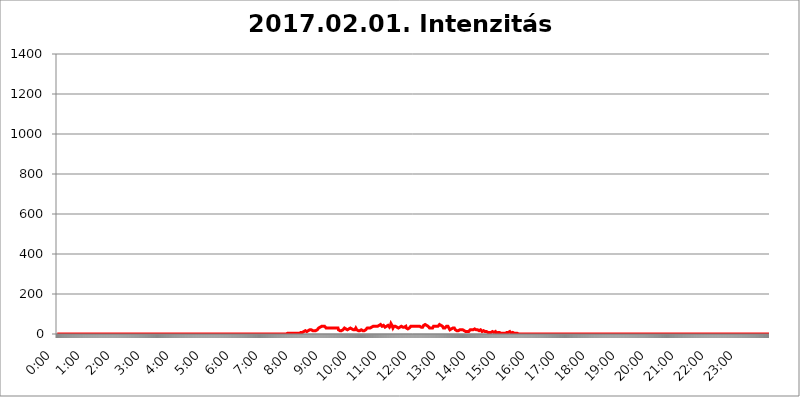
| Category | 2017.02.01. Intenzitás [W/m^2] |
|---|---|
| 0.0 | 0 |
| 0.0006944444444444445 | 0 |
| 0.001388888888888889 | 0 |
| 0.0020833333333333333 | 0 |
| 0.002777777777777778 | 0 |
| 0.003472222222222222 | 0 |
| 0.004166666666666667 | 0 |
| 0.004861111111111111 | 0 |
| 0.005555555555555556 | 0 |
| 0.0062499999999999995 | 0 |
| 0.006944444444444444 | 0 |
| 0.007638888888888889 | 0 |
| 0.008333333333333333 | 0 |
| 0.009027777777777779 | 0 |
| 0.009722222222222222 | 0 |
| 0.010416666666666666 | 0 |
| 0.011111111111111112 | 0 |
| 0.011805555555555555 | 0 |
| 0.012499999999999999 | 0 |
| 0.013194444444444444 | 0 |
| 0.013888888888888888 | 0 |
| 0.014583333333333332 | 0 |
| 0.015277777777777777 | 0 |
| 0.015972222222222224 | 0 |
| 0.016666666666666666 | 0 |
| 0.017361111111111112 | 0 |
| 0.018055555555555557 | 0 |
| 0.01875 | 0 |
| 0.019444444444444445 | 0 |
| 0.02013888888888889 | 0 |
| 0.020833333333333332 | 0 |
| 0.02152777777777778 | 0 |
| 0.022222222222222223 | 0 |
| 0.02291666666666667 | 0 |
| 0.02361111111111111 | 0 |
| 0.024305555555555556 | 0 |
| 0.024999999999999998 | 0 |
| 0.025694444444444447 | 0 |
| 0.02638888888888889 | 0 |
| 0.027083333333333334 | 0 |
| 0.027777777777777776 | 0 |
| 0.02847222222222222 | 0 |
| 0.029166666666666664 | 0 |
| 0.029861111111111113 | 0 |
| 0.030555555555555555 | 0 |
| 0.03125 | 0 |
| 0.03194444444444445 | 0 |
| 0.03263888888888889 | 0 |
| 0.03333333333333333 | 0 |
| 0.034027777777777775 | 0 |
| 0.034722222222222224 | 0 |
| 0.035416666666666666 | 0 |
| 0.036111111111111115 | 0 |
| 0.03680555555555556 | 0 |
| 0.0375 | 0 |
| 0.03819444444444444 | 0 |
| 0.03888888888888889 | 0 |
| 0.03958333333333333 | 0 |
| 0.04027777777777778 | 0 |
| 0.04097222222222222 | 0 |
| 0.041666666666666664 | 0 |
| 0.042361111111111106 | 0 |
| 0.04305555555555556 | 0 |
| 0.043750000000000004 | 0 |
| 0.044444444444444446 | 0 |
| 0.04513888888888889 | 0 |
| 0.04583333333333334 | 0 |
| 0.04652777777777778 | 0 |
| 0.04722222222222222 | 0 |
| 0.04791666666666666 | 0 |
| 0.04861111111111111 | 0 |
| 0.049305555555555554 | 0 |
| 0.049999999999999996 | 0 |
| 0.05069444444444445 | 0 |
| 0.051388888888888894 | 0 |
| 0.052083333333333336 | 0 |
| 0.05277777777777778 | 0 |
| 0.05347222222222222 | 0 |
| 0.05416666666666667 | 0 |
| 0.05486111111111111 | 0 |
| 0.05555555555555555 | 0 |
| 0.05625 | 0 |
| 0.05694444444444444 | 0 |
| 0.057638888888888885 | 0 |
| 0.05833333333333333 | 0 |
| 0.05902777777777778 | 0 |
| 0.059722222222222225 | 0 |
| 0.06041666666666667 | 0 |
| 0.061111111111111116 | 0 |
| 0.06180555555555556 | 0 |
| 0.0625 | 0 |
| 0.06319444444444444 | 0 |
| 0.06388888888888888 | 0 |
| 0.06458333333333334 | 0 |
| 0.06527777777777778 | 0 |
| 0.06597222222222222 | 0 |
| 0.06666666666666667 | 0 |
| 0.06736111111111111 | 0 |
| 0.06805555555555555 | 0 |
| 0.06874999999999999 | 0 |
| 0.06944444444444443 | 0 |
| 0.07013888888888889 | 0 |
| 0.07083333333333333 | 0 |
| 0.07152777777777779 | 0 |
| 0.07222222222222223 | 0 |
| 0.07291666666666667 | 0 |
| 0.07361111111111111 | 0 |
| 0.07430555555555556 | 0 |
| 0.075 | 0 |
| 0.07569444444444444 | 0 |
| 0.0763888888888889 | 0 |
| 0.07708333333333334 | 0 |
| 0.07777777777777778 | 0 |
| 0.07847222222222222 | 0 |
| 0.07916666666666666 | 0 |
| 0.0798611111111111 | 0 |
| 0.08055555555555556 | 0 |
| 0.08125 | 0 |
| 0.08194444444444444 | 0 |
| 0.08263888888888889 | 0 |
| 0.08333333333333333 | 0 |
| 0.08402777777777777 | 0 |
| 0.08472222222222221 | 0 |
| 0.08541666666666665 | 0 |
| 0.08611111111111112 | 0 |
| 0.08680555555555557 | 0 |
| 0.08750000000000001 | 0 |
| 0.08819444444444445 | 0 |
| 0.08888888888888889 | 0 |
| 0.08958333333333333 | 0 |
| 0.09027777777777778 | 0 |
| 0.09097222222222222 | 0 |
| 0.09166666666666667 | 0 |
| 0.09236111111111112 | 0 |
| 0.09305555555555556 | 0 |
| 0.09375 | 0 |
| 0.09444444444444444 | 0 |
| 0.09513888888888888 | 0 |
| 0.09583333333333333 | 0 |
| 0.09652777777777777 | 0 |
| 0.09722222222222222 | 0 |
| 0.09791666666666667 | 0 |
| 0.09861111111111111 | 0 |
| 0.09930555555555555 | 0 |
| 0.09999999999999999 | 0 |
| 0.10069444444444443 | 0 |
| 0.1013888888888889 | 0 |
| 0.10208333333333335 | 0 |
| 0.10277777777777779 | 0 |
| 0.10347222222222223 | 0 |
| 0.10416666666666667 | 0 |
| 0.10486111111111111 | 0 |
| 0.10555555555555556 | 0 |
| 0.10625 | 0 |
| 0.10694444444444444 | 0 |
| 0.1076388888888889 | 0 |
| 0.10833333333333334 | 0 |
| 0.10902777777777778 | 0 |
| 0.10972222222222222 | 0 |
| 0.1111111111111111 | 0 |
| 0.11180555555555556 | 0 |
| 0.11180555555555556 | 0 |
| 0.1125 | 0 |
| 0.11319444444444444 | 0 |
| 0.11388888888888889 | 0 |
| 0.11458333333333333 | 0 |
| 0.11527777777777777 | 0 |
| 0.11597222222222221 | 0 |
| 0.11666666666666665 | 0 |
| 0.1173611111111111 | 0 |
| 0.11805555555555557 | 0 |
| 0.11944444444444445 | 0 |
| 0.12013888888888889 | 0 |
| 0.12083333333333333 | 0 |
| 0.12152777777777778 | 0 |
| 0.12222222222222223 | 0 |
| 0.12291666666666667 | 0 |
| 0.12291666666666667 | 0 |
| 0.12361111111111112 | 0 |
| 0.12430555555555556 | 0 |
| 0.125 | 0 |
| 0.12569444444444444 | 0 |
| 0.12638888888888888 | 0 |
| 0.12708333333333333 | 0 |
| 0.16875 | 0 |
| 0.12847222222222224 | 0 |
| 0.12916666666666668 | 0 |
| 0.12986111111111112 | 0 |
| 0.13055555555555556 | 0 |
| 0.13125 | 0 |
| 0.13194444444444445 | 0 |
| 0.1326388888888889 | 0 |
| 0.13333333333333333 | 0 |
| 0.13402777777777777 | 0 |
| 0.13402777777777777 | 0 |
| 0.13472222222222222 | 0 |
| 0.13541666666666666 | 0 |
| 0.1361111111111111 | 0 |
| 0.13749999999999998 | 0 |
| 0.13819444444444443 | 0 |
| 0.1388888888888889 | 0 |
| 0.13958333333333334 | 0 |
| 0.14027777777777778 | 0 |
| 0.14097222222222222 | 0 |
| 0.14166666666666666 | 0 |
| 0.1423611111111111 | 0 |
| 0.14305555555555557 | 0 |
| 0.14375000000000002 | 0 |
| 0.14444444444444446 | 0 |
| 0.1451388888888889 | 0 |
| 0.1451388888888889 | 0 |
| 0.14652777777777778 | 0 |
| 0.14722222222222223 | 0 |
| 0.14791666666666667 | 0 |
| 0.1486111111111111 | 0 |
| 0.14930555555555555 | 0 |
| 0.15 | 0 |
| 0.15069444444444444 | 0 |
| 0.15138888888888888 | 0 |
| 0.15208333333333332 | 0 |
| 0.15277777777777776 | 0 |
| 0.15347222222222223 | 0 |
| 0.15416666666666667 | 0 |
| 0.15486111111111112 | 0 |
| 0.15555555555555556 | 0 |
| 0.15625 | 0 |
| 0.15694444444444444 | 0 |
| 0.15763888888888888 | 0 |
| 0.15833333333333333 | 0 |
| 0.15902777777777777 | 0 |
| 0.15972222222222224 | 0 |
| 0.16041666666666668 | 0 |
| 0.16111111111111112 | 0 |
| 0.16180555555555556 | 0 |
| 0.1625 | 0 |
| 0.16319444444444445 | 0 |
| 0.1638888888888889 | 0 |
| 0.16458333333333333 | 0 |
| 0.16527777777777777 | 0 |
| 0.16597222222222222 | 0 |
| 0.16666666666666666 | 0 |
| 0.1673611111111111 | 0 |
| 0.16805555555555554 | 0 |
| 0.16874999999999998 | 0 |
| 0.16944444444444443 | 0 |
| 0.17013888888888887 | 0 |
| 0.1708333333333333 | 0 |
| 0.17152777777777775 | 0 |
| 0.17222222222222225 | 0 |
| 0.1729166666666667 | 0 |
| 0.17361111111111113 | 0 |
| 0.17430555555555557 | 0 |
| 0.17500000000000002 | 0 |
| 0.17569444444444446 | 0 |
| 0.1763888888888889 | 0 |
| 0.17708333333333334 | 0 |
| 0.17777777777777778 | 0 |
| 0.17847222222222223 | 0 |
| 0.17916666666666667 | 0 |
| 0.1798611111111111 | 0 |
| 0.18055555555555555 | 0 |
| 0.18125 | 0 |
| 0.18194444444444444 | 0 |
| 0.1826388888888889 | 0 |
| 0.18333333333333335 | 0 |
| 0.1840277777777778 | 0 |
| 0.18472222222222223 | 0 |
| 0.18541666666666667 | 0 |
| 0.18611111111111112 | 0 |
| 0.18680555555555556 | 0 |
| 0.1875 | 0 |
| 0.18819444444444444 | 0 |
| 0.18888888888888888 | 0 |
| 0.18958333333333333 | 0 |
| 0.19027777777777777 | 0 |
| 0.1909722222222222 | 0 |
| 0.19166666666666665 | 0 |
| 0.19236111111111112 | 0 |
| 0.19305555555555554 | 0 |
| 0.19375 | 0 |
| 0.19444444444444445 | 0 |
| 0.1951388888888889 | 0 |
| 0.19583333333333333 | 0 |
| 0.19652777777777777 | 0 |
| 0.19722222222222222 | 0 |
| 0.19791666666666666 | 0 |
| 0.1986111111111111 | 0 |
| 0.19930555555555554 | 0 |
| 0.19999999999999998 | 0 |
| 0.20069444444444443 | 0 |
| 0.20138888888888887 | 0 |
| 0.2020833333333333 | 0 |
| 0.2027777777777778 | 0 |
| 0.2034722222222222 | 0 |
| 0.2041666666666667 | 0 |
| 0.20486111111111113 | 0 |
| 0.20555555555555557 | 0 |
| 0.20625000000000002 | 0 |
| 0.20694444444444446 | 0 |
| 0.2076388888888889 | 0 |
| 0.20833333333333334 | 0 |
| 0.20902777777777778 | 0 |
| 0.20972222222222223 | 0 |
| 0.21041666666666667 | 0 |
| 0.2111111111111111 | 0 |
| 0.21180555555555555 | 0 |
| 0.2125 | 0 |
| 0.21319444444444444 | 0 |
| 0.2138888888888889 | 0 |
| 0.21458333333333335 | 0 |
| 0.2152777777777778 | 0 |
| 0.21597222222222223 | 0 |
| 0.21666666666666667 | 0 |
| 0.21736111111111112 | 0 |
| 0.21805555555555556 | 0 |
| 0.21875 | 0 |
| 0.21944444444444444 | 0 |
| 0.22013888888888888 | 0 |
| 0.22083333333333333 | 0 |
| 0.22152777777777777 | 0 |
| 0.2222222222222222 | 0 |
| 0.22291666666666665 | 0 |
| 0.2236111111111111 | 0 |
| 0.22430555555555556 | 0 |
| 0.225 | 0 |
| 0.22569444444444445 | 0 |
| 0.2263888888888889 | 0 |
| 0.22708333333333333 | 0 |
| 0.22777777777777777 | 0 |
| 0.22847222222222222 | 0 |
| 0.22916666666666666 | 0 |
| 0.2298611111111111 | 0 |
| 0.23055555555555554 | 0 |
| 0.23124999999999998 | 0 |
| 0.23194444444444443 | 0 |
| 0.23263888888888887 | 0 |
| 0.2333333333333333 | 0 |
| 0.2340277777777778 | 0 |
| 0.2347222222222222 | 0 |
| 0.2354166666666667 | 0 |
| 0.23611111111111113 | 0 |
| 0.23680555555555557 | 0 |
| 0.23750000000000002 | 0 |
| 0.23819444444444446 | 0 |
| 0.2388888888888889 | 0 |
| 0.23958333333333334 | 0 |
| 0.24027777777777778 | 0 |
| 0.24097222222222223 | 0 |
| 0.24166666666666667 | 0 |
| 0.2423611111111111 | 0 |
| 0.24305555555555555 | 0 |
| 0.24375 | 0 |
| 0.24444444444444446 | 0 |
| 0.24513888888888888 | 0 |
| 0.24583333333333335 | 0 |
| 0.2465277777777778 | 0 |
| 0.24722222222222223 | 0 |
| 0.24791666666666667 | 0 |
| 0.24861111111111112 | 0 |
| 0.24930555555555556 | 0 |
| 0.25 | 0 |
| 0.25069444444444444 | 0 |
| 0.2513888888888889 | 0 |
| 0.2520833333333333 | 0 |
| 0.25277777777777777 | 0 |
| 0.2534722222222222 | 0 |
| 0.25416666666666665 | 0 |
| 0.2548611111111111 | 0 |
| 0.2555555555555556 | 0 |
| 0.25625000000000003 | 0 |
| 0.2569444444444445 | 0 |
| 0.2576388888888889 | 0 |
| 0.25833333333333336 | 0 |
| 0.2590277777777778 | 0 |
| 0.25972222222222224 | 0 |
| 0.2604166666666667 | 0 |
| 0.2611111111111111 | 0 |
| 0.26180555555555557 | 0 |
| 0.2625 | 0 |
| 0.26319444444444445 | 0 |
| 0.2638888888888889 | 0 |
| 0.26458333333333334 | 0 |
| 0.2652777777777778 | 0 |
| 0.2659722222222222 | 0 |
| 0.26666666666666666 | 0 |
| 0.2673611111111111 | 0 |
| 0.26805555555555555 | 0 |
| 0.26875 | 0 |
| 0.26944444444444443 | 0 |
| 0.2701388888888889 | 0 |
| 0.2708333333333333 | 0 |
| 0.27152777777777776 | 0 |
| 0.2722222222222222 | 0 |
| 0.27291666666666664 | 0 |
| 0.2736111111111111 | 0 |
| 0.2743055555555555 | 0 |
| 0.27499999999999997 | 0 |
| 0.27569444444444446 | 0 |
| 0.27638888888888885 | 0 |
| 0.27708333333333335 | 0 |
| 0.2777777777777778 | 0 |
| 0.27847222222222223 | 0 |
| 0.2791666666666667 | 0 |
| 0.2798611111111111 | 0 |
| 0.28055555555555556 | 0 |
| 0.28125 | 0 |
| 0.28194444444444444 | 0 |
| 0.2826388888888889 | 0 |
| 0.2833333333333333 | 0 |
| 0.28402777777777777 | 0 |
| 0.2847222222222222 | 0 |
| 0.28541666666666665 | 0 |
| 0.28611111111111115 | 0 |
| 0.28680555555555554 | 0 |
| 0.28750000000000003 | 0 |
| 0.2881944444444445 | 0 |
| 0.2888888888888889 | 0 |
| 0.28958333333333336 | 0 |
| 0.2902777777777778 | 0 |
| 0.29097222222222224 | 0 |
| 0.2916666666666667 | 0 |
| 0.2923611111111111 | 0 |
| 0.29305555555555557 | 0 |
| 0.29375 | 0 |
| 0.29444444444444445 | 0 |
| 0.2951388888888889 | 0 |
| 0.29583333333333334 | 0 |
| 0.2965277777777778 | 0 |
| 0.2972222222222222 | 0 |
| 0.29791666666666666 | 0 |
| 0.2986111111111111 | 0 |
| 0.29930555555555555 | 0 |
| 0.3 | 0 |
| 0.30069444444444443 | 0 |
| 0.3013888888888889 | 0 |
| 0.3020833333333333 | 0 |
| 0.30277777777777776 | 0 |
| 0.3034722222222222 | 0 |
| 0.30416666666666664 | 0 |
| 0.3048611111111111 | 0 |
| 0.3055555555555555 | 0 |
| 0.30624999999999997 | 0 |
| 0.3069444444444444 | 0 |
| 0.3076388888888889 | 0 |
| 0.30833333333333335 | 0 |
| 0.3090277777777778 | 0 |
| 0.30972222222222223 | 0 |
| 0.3104166666666667 | 0 |
| 0.3111111111111111 | 0 |
| 0.31180555555555556 | 0 |
| 0.3125 | 0 |
| 0.31319444444444444 | 0 |
| 0.3138888888888889 | 0 |
| 0.3145833333333333 | 0 |
| 0.31527777777777777 | 0 |
| 0.3159722222222222 | 0 |
| 0.31666666666666665 | 0 |
| 0.31736111111111115 | 0 |
| 0.31805555555555554 | 0 |
| 0.31875000000000003 | 0 |
| 0.3194444444444445 | 0 |
| 0.3201388888888889 | 0 |
| 0.32083333333333336 | 0 |
| 0.3215277777777778 | 0 |
| 0.32222222222222224 | 3.525 |
| 0.3229166666666667 | 3.525 |
| 0.3236111111111111 | 3.525 |
| 0.32430555555555557 | 3.525 |
| 0.325 | 3.525 |
| 0.32569444444444445 | 3.525 |
| 0.3263888888888889 | 3.525 |
| 0.32708333333333334 | 3.525 |
| 0.3277777777777778 | 3.525 |
| 0.3284722222222222 | 3.525 |
| 0.32916666666666666 | 3.525 |
| 0.3298611111111111 | 3.525 |
| 0.33055555555555555 | 3.525 |
| 0.33125 | 3.525 |
| 0.33194444444444443 | 3.525 |
| 0.3326388888888889 | 3.525 |
| 0.3333333333333333 | 3.525 |
| 0.3340277777777778 | 3.525 |
| 0.3347222222222222 | 3.525 |
| 0.3354166666666667 | 3.525 |
| 0.3361111111111111 | 3.525 |
| 0.3368055555555556 | 3.525 |
| 0.33749999999999997 | 3.525 |
| 0.33819444444444446 | 3.525 |
| 0.33888888888888885 | 3.525 |
| 0.33958333333333335 | 3.525 |
| 0.34027777777777773 | 7.887 |
| 0.34097222222222223 | 7.887 |
| 0.3416666666666666 | 7.887 |
| 0.3423611111111111 | 7.887 |
| 0.3430555555555555 | 7.887 |
| 0.34375 | 7.887 |
| 0.3444444444444445 | 12.257 |
| 0.3451388888888889 | 12.257 |
| 0.3458333333333334 | 12.257 |
| 0.34652777777777777 | 12.257 |
| 0.34722222222222227 | 16.636 |
| 0.34791666666666665 | 16.636 |
| 0.34861111111111115 | 16.636 |
| 0.34930555555555554 | 16.636 |
| 0.35000000000000003 | 12.257 |
| 0.3506944444444444 | 12.257 |
| 0.3513888888888889 | 16.636 |
| 0.3520833333333333 | 16.636 |
| 0.3527777777777778 | 21.024 |
| 0.3534722222222222 | 21.024 |
| 0.3541666666666667 | 21.024 |
| 0.3548611111111111 | 21.024 |
| 0.35555555555555557 | 21.024 |
| 0.35625 | 21.024 |
| 0.35694444444444445 | 21.024 |
| 0.3576388888888889 | 16.636 |
| 0.35833333333333334 | 16.636 |
| 0.3590277777777778 | 16.636 |
| 0.3597222222222222 | 16.636 |
| 0.36041666666666666 | 16.636 |
| 0.3611111111111111 | 16.636 |
| 0.36180555555555555 | 16.636 |
| 0.3625 | 16.636 |
| 0.36319444444444443 | 21.024 |
| 0.3638888888888889 | 21.024 |
| 0.3645833333333333 | 21.024 |
| 0.3652777777777778 | 25.419 |
| 0.3659722222222222 | 25.419 |
| 0.3666666666666667 | 29.823 |
| 0.3673611111111111 | 34.234 |
| 0.3680555555555556 | 34.234 |
| 0.36874999999999997 | 34.234 |
| 0.36944444444444446 | 38.653 |
| 0.37013888888888885 | 38.653 |
| 0.37083333333333335 | 38.653 |
| 0.37152777777777773 | 34.234 |
| 0.37222222222222223 | 34.234 |
| 0.3729166666666666 | 38.653 |
| 0.3736111111111111 | 38.653 |
| 0.3743055555555555 | 38.653 |
| 0.375 | 38.653 |
| 0.3756944444444445 | 34.234 |
| 0.3763888888888889 | 34.234 |
| 0.3770833333333334 | 29.823 |
| 0.37777777777777777 | 25.419 |
| 0.37847222222222227 | 25.419 |
| 0.37916666666666665 | 29.823 |
| 0.37986111111111115 | 29.823 |
| 0.38055555555555554 | 29.823 |
| 0.38125000000000003 | 29.823 |
| 0.3819444444444444 | 29.823 |
| 0.3826388888888889 | 29.823 |
| 0.3833333333333333 | 29.823 |
| 0.3840277777777778 | 29.823 |
| 0.3847222222222222 | 29.823 |
| 0.3854166666666667 | 29.823 |
| 0.3861111111111111 | 29.823 |
| 0.38680555555555557 | 29.823 |
| 0.3875 | 29.823 |
| 0.38819444444444445 | 29.823 |
| 0.3888888888888889 | 29.823 |
| 0.38958333333333334 | 29.823 |
| 0.3902777777777778 | 29.823 |
| 0.3909722222222222 | 29.823 |
| 0.39166666666666666 | 29.823 |
| 0.3923611111111111 | 29.823 |
| 0.39305555555555555 | 29.823 |
| 0.39375 | 29.823 |
| 0.39444444444444443 | 21.024 |
| 0.3951388888888889 | 21.024 |
| 0.3958333333333333 | 21.024 |
| 0.3965277777777778 | 16.636 |
| 0.3972222222222222 | 16.636 |
| 0.3979166666666667 | 16.636 |
| 0.3986111111111111 | 16.636 |
| 0.3993055555555556 | 16.636 |
| 0.39999999999999997 | 21.024 |
| 0.40069444444444446 | 21.024 |
| 0.40138888888888885 | 25.419 |
| 0.40208333333333335 | 25.419 |
| 0.40277777777777773 | 29.823 |
| 0.40347222222222223 | 29.823 |
| 0.4041666666666666 | 25.419 |
| 0.4048611111111111 | 25.419 |
| 0.4055555555555555 | 25.419 |
| 0.40625 | 21.024 |
| 0.4069444444444445 | 21.024 |
| 0.4076388888888889 | 21.024 |
| 0.4083333333333334 | 21.024 |
| 0.40902777777777777 | 25.419 |
| 0.40972222222222227 | 29.823 |
| 0.41041666666666665 | 29.823 |
| 0.41111111111111115 | 29.823 |
| 0.41180555555555554 | 25.419 |
| 0.41250000000000003 | 25.419 |
| 0.4131944444444444 | 25.419 |
| 0.4138888888888889 | 25.419 |
| 0.4145833333333333 | 21.024 |
| 0.4152777777777778 | 21.024 |
| 0.4159722222222222 | 21.024 |
| 0.4166666666666667 | 21.024 |
| 0.4173611111111111 | 21.024 |
| 0.41805555555555557 | 25.419 |
| 0.41875 | 29.823 |
| 0.41944444444444445 | 25.419 |
| 0.4201388888888889 | 21.024 |
| 0.42083333333333334 | 21.024 |
| 0.4215277777777778 | 16.636 |
| 0.4222222222222222 | 16.636 |
| 0.42291666666666666 | 12.257 |
| 0.4236111111111111 | 16.636 |
| 0.42430555555555555 | 16.636 |
| 0.425 | 16.636 |
| 0.42569444444444443 | 21.024 |
| 0.4263888888888889 | 21.024 |
| 0.4270833333333333 | 21.024 |
| 0.4277777777777778 | 21.024 |
| 0.4284722222222222 | 16.636 |
| 0.4291666666666667 | 16.636 |
| 0.4298611111111111 | 16.636 |
| 0.4305555555555556 | 16.636 |
| 0.43124999999999997 | 16.636 |
| 0.43194444444444446 | 21.024 |
| 0.43263888888888885 | 21.024 |
| 0.43333333333333335 | 21.024 |
| 0.43402777777777773 | 25.419 |
| 0.43472222222222223 | 29.823 |
| 0.4354166666666666 | 29.823 |
| 0.4361111111111111 | 29.823 |
| 0.4368055555555555 | 29.823 |
| 0.4375 | 29.823 |
| 0.4381944444444445 | 29.823 |
| 0.4388888888888889 | 29.823 |
| 0.4395833333333334 | 29.823 |
| 0.44027777777777777 | 29.823 |
| 0.44097222222222227 | 34.234 |
| 0.44166666666666665 | 38.653 |
| 0.44236111111111115 | 38.653 |
| 0.44305555555555554 | 38.653 |
| 0.44375000000000003 | 38.653 |
| 0.4444444444444444 | 38.653 |
| 0.4451388888888889 | 38.653 |
| 0.4458333333333333 | 38.653 |
| 0.4465277777777778 | 38.653 |
| 0.4472222222222222 | 38.653 |
| 0.4479166666666667 | 34.234 |
| 0.4486111111111111 | 34.234 |
| 0.44930555555555557 | 38.653 |
| 0.45 | 38.653 |
| 0.45069444444444445 | 43.079 |
| 0.4513888888888889 | 43.079 |
| 0.45208333333333334 | 43.079 |
| 0.4527777777777778 | 43.079 |
| 0.4534722222222222 | 47.511 |
| 0.45416666666666666 | 43.079 |
| 0.4548611111111111 | 43.079 |
| 0.45555555555555555 | 38.653 |
| 0.45625 | 38.653 |
| 0.45694444444444443 | 38.653 |
| 0.4576388888888889 | 43.079 |
| 0.4583333333333333 | 38.653 |
| 0.4590277777777778 | 38.653 |
| 0.4597222222222222 | 34.234 |
| 0.4604166666666667 | 34.234 |
| 0.4611111111111111 | 38.653 |
| 0.4618055555555556 | 38.653 |
| 0.46249999999999997 | 34.234 |
| 0.46319444444444446 | 38.653 |
| 0.46388888888888885 | 43.079 |
| 0.46458333333333335 | 43.079 |
| 0.46527777777777773 | 38.653 |
| 0.46597222222222223 | 34.234 |
| 0.4666666666666666 | 38.653 |
| 0.4673611111111111 | 43.079 |
| 0.4680555555555555 | 51.951 |
| 0.46875 | 47.511 |
| 0.4694444444444445 | 43.079 |
| 0.4701388888888889 | 38.653 |
| 0.4708333333333334 | 29.823 |
| 0.47152777777777777 | 29.823 |
| 0.47222222222222227 | 38.653 |
| 0.47291666666666665 | 38.653 |
| 0.47361111111111115 | 38.653 |
| 0.47430555555555554 | 38.653 |
| 0.47500000000000003 | 38.653 |
| 0.4756944444444444 | 34.234 |
| 0.4763888888888889 | 34.234 |
| 0.4770833333333333 | 34.234 |
| 0.4777777777777778 | 34.234 |
| 0.4784722222222222 | 29.823 |
| 0.4791666666666667 | 29.823 |
| 0.4798611111111111 | 34.234 |
| 0.48055555555555557 | 34.234 |
| 0.48125 | 34.234 |
| 0.48194444444444445 | 38.653 |
| 0.4826388888888889 | 38.653 |
| 0.48333333333333334 | 38.653 |
| 0.4840277777777778 | 38.653 |
| 0.4847222222222222 | 34.234 |
| 0.48541666666666666 | 34.234 |
| 0.4861111111111111 | 34.234 |
| 0.48680555555555555 | 34.234 |
| 0.4875 | 34.234 |
| 0.48819444444444443 | 38.653 |
| 0.4888888888888889 | 38.653 |
| 0.4895833333333333 | 29.823 |
| 0.4902777777777778 | 25.419 |
| 0.4909722222222222 | 25.419 |
| 0.4916666666666667 | 25.419 |
| 0.4923611111111111 | 29.823 |
| 0.4930555555555556 | 29.823 |
| 0.49374999999999997 | 29.823 |
| 0.49444444444444446 | 34.234 |
| 0.49513888888888885 | 34.234 |
| 0.49583333333333335 | 38.653 |
| 0.49652777777777773 | 38.653 |
| 0.49722222222222223 | 34.234 |
| 0.4979166666666666 | 38.653 |
| 0.4986111111111111 | 43.079 |
| 0.4993055555555555 | 38.653 |
| 0.5 | 38.653 |
| 0.5006944444444444 | 38.653 |
| 0.5013888888888889 | 38.653 |
| 0.5020833333333333 | 38.653 |
| 0.5027777777777778 | 38.653 |
| 0.5034722222222222 | 38.653 |
| 0.5041666666666667 | 38.653 |
| 0.5048611111111111 | 38.653 |
| 0.5055555555555555 | 38.653 |
| 0.50625 | 38.653 |
| 0.5069444444444444 | 34.234 |
| 0.5076388888888889 | 38.653 |
| 0.5083333333333333 | 38.653 |
| 0.5090277777777777 | 38.653 |
| 0.5097222222222222 | 34.234 |
| 0.5104166666666666 | 34.234 |
| 0.5111111111111112 | 29.823 |
| 0.5118055555555555 | 29.823 |
| 0.5125000000000001 | 34.234 |
| 0.5131944444444444 | 38.653 |
| 0.513888888888889 | 43.079 |
| 0.5145833333333333 | 47.511 |
| 0.5152777777777778 | 47.511 |
| 0.5159722222222222 | 47.511 |
| 0.5166666666666667 | 47.511 |
| 0.517361111111111 | 47.511 |
| 0.5180555555555556 | 43.079 |
| 0.5187499999999999 | 38.653 |
| 0.5194444444444445 | 38.653 |
| 0.5201388888888888 | 38.653 |
| 0.5208333333333334 | 38.653 |
| 0.5215277777777778 | 34.234 |
| 0.5222222222222223 | 29.823 |
| 0.5229166666666667 | 29.823 |
| 0.5236111111111111 | 34.234 |
| 0.5243055555555556 | 29.823 |
| 0.525 | 29.823 |
| 0.5256944444444445 | 29.823 |
| 0.5263888888888889 | 29.823 |
| 0.5270833333333333 | 34.234 |
| 0.5277777777777778 | 38.653 |
| 0.5284722222222222 | 38.653 |
| 0.5291666666666667 | 38.653 |
| 0.5298611111111111 | 38.653 |
| 0.5305555555555556 | 38.653 |
| 0.53125 | 38.653 |
| 0.5319444444444444 | 38.653 |
| 0.5326388888888889 | 38.653 |
| 0.5333333333333333 | 43.079 |
| 0.5340277777777778 | 38.653 |
| 0.5347222222222222 | 38.653 |
| 0.5354166666666667 | 43.079 |
| 0.5361111111111111 | 47.511 |
| 0.5368055555555555 | 47.511 |
| 0.5375 | 47.511 |
| 0.5381944444444444 | 43.079 |
| 0.5388888888888889 | 43.079 |
| 0.5395833333333333 | 38.653 |
| 0.5402777777777777 | 38.653 |
| 0.5409722222222222 | 34.234 |
| 0.5416666666666666 | 29.823 |
| 0.5423611111111112 | 29.823 |
| 0.5430555555555555 | 29.823 |
| 0.5437500000000001 | 29.823 |
| 0.5444444444444444 | 29.823 |
| 0.545138888888889 | 34.234 |
| 0.5458333333333333 | 38.653 |
| 0.5465277777777778 | 38.653 |
| 0.5472222222222222 | 38.653 |
| 0.5479166666666667 | 38.653 |
| 0.548611111111111 | 34.234 |
| 0.5493055555555556 | 29.823 |
| 0.5499999999999999 | 25.419 |
| 0.5506944444444445 | 21.024 |
| 0.5513888888888888 | 21.024 |
| 0.5520833333333334 | 21.024 |
| 0.5527777777777778 | 25.419 |
| 0.5534722222222223 | 25.419 |
| 0.5541666666666667 | 29.823 |
| 0.5548611111111111 | 29.823 |
| 0.5555555555555556 | 29.823 |
| 0.55625 | 29.823 |
| 0.5569444444444445 | 29.823 |
| 0.5576388888888889 | 25.419 |
| 0.5583333333333333 | 21.024 |
| 0.5590277777777778 | 21.024 |
| 0.5597222222222222 | 21.024 |
| 0.5604166666666667 | 16.636 |
| 0.5611111111111111 | 16.636 |
| 0.5618055555555556 | 16.636 |
| 0.5625 | 16.636 |
| 0.5631944444444444 | 21.024 |
| 0.5638888888888889 | 21.024 |
| 0.5645833333333333 | 21.024 |
| 0.5652777777777778 | 21.024 |
| 0.5659722222222222 | 21.024 |
| 0.5666666666666667 | 21.024 |
| 0.5673611111111111 | 21.024 |
| 0.5680555555555555 | 21.024 |
| 0.56875 | 21.024 |
| 0.5694444444444444 | 21.024 |
| 0.5701388888888889 | 16.636 |
| 0.5708333333333333 | 16.636 |
| 0.5715277777777777 | 16.636 |
| 0.5722222222222222 | 12.257 |
| 0.5729166666666666 | 12.257 |
| 0.5736111111111112 | 12.257 |
| 0.5743055555555555 | 12.257 |
| 0.5750000000000001 | 12.257 |
| 0.5756944444444444 | 12.257 |
| 0.576388888888889 | 12.257 |
| 0.5770833333333333 | 12.257 |
| 0.5777777777777778 | 12.257 |
| 0.5784722222222222 | 16.636 |
| 0.5791666666666667 | 21.024 |
| 0.579861111111111 | 21.024 |
| 0.5805555555555556 | 21.024 |
| 0.5812499999999999 | 21.024 |
| 0.5819444444444445 | 25.419 |
| 0.5826388888888888 | 25.419 |
| 0.5833333333333334 | 21.024 |
| 0.5840277777777778 | 21.024 |
| 0.5847222222222223 | 21.024 |
| 0.5854166666666667 | 25.419 |
| 0.5861111111111111 | 25.419 |
| 0.5868055555555556 | 21.024 |
| 0.5875 | 21.024 |
| 0.5881944444444445 | 21.024 |
| 0.5888888888888889 | 21.024 |
| 0.5895833333333333 | 21.024 |
| 0.5902777777777778 | 21.024 |
| 0.5909722222222222 | 21.024 |
| 0.5916666666666667 | 16.636 |
| 0.5923611111111111 | 16.636 |
| 0.5930555555555556 | 16.636 |
| 0.59375 | 21.024 |
| 0.5944444444444444 | 16.636 |
| 0.5951388888888889 | 16.636 |
| 0.5958333333333333 | 12.257 |
| 0.5965277777777778 | 16.636 |
| 0.5972222222222222 | 16.636 |
| 0.5979166666666667 | 16.636 |
| 0.5986111111111111 | 12.257 |
| 0.5993055555555555 | 12.257 |
| 0.6 | 12.257 |
| 0.6006944444444444 | 12.257 |
| 0.6013888888888889 | 12.257 |
| 0.6020833333333333 | 12.257 |
| 0.6027777777777777 | 12.257 |
| 0.6034722222222222 | 12.257 |
| 0.6041666666666666 | 7.887 |
| 0.6048611111111112 | 7.887 |
| 0.6055555555555555 | 7.887 |
| 0.6062500000000001 | 7.887 |
| 0.6069444444444444 | 7.887 |
| 0.607638888888889 | 7.887 |
| 0.6083333333333333 | 7.887 |
| 0.6090277777777778 | 7.887 |
| 0.6097222222222222 | 7.887 |
| 0.6104166666666667 | 12.257 |
| 0.611111111111111 | 7.887 |
| 0.6118055555555556 | 7.887 |
| 0.6124999999999999 | 7.887 |
| 0.6131944444444445 | 7.887 |
| 0.6138888888888888 | 12.257 |
| 0.6145833333333334 | 12.257 |
| 0.6152777777777778 | 7.887 |
| 0.6159722222222223 | 3.525 |
| 0.6166666666666667 | 3.525 |
| 0.6173611111111111 | 3.525 |
| 0.6180555555555556 | 7.887 |
| 0.61875 | 7.887 |
| 0.6194444444444445 | 12.257 |
| 0.6201388888888889 | 7.887 |
| 0.6208333333333333 | 7.887 |
| 0.6215277777777778 | 7.887 |
| 0.6222222222222222 | 3.525 |
| 0.6229166666666667 | 3.525 |
| 0.6236111111111111 | 3.525 |
| 0.6243055555555556 | 3.525 |
| 0.625 | 3.525 |
| 0.6256944444444444 | 7.887 |
| 0.6263888888888889 | 3.525 |
| 0.6270833333333333 | 3.525 |
| 0.6277777777777778 | 3.525 |
| 0.6284722222222222 | 3.525 |
| 0.6291666666666667 | 7.887 |
| 0.6298611111111111 | 7.887 |
| 0.6305555555555555 | 7.887 |
| 0.63125 | 7.887 |
| 0.6319444444444444 | 7.887 |
| 0.6326388888888889 | 7.887 |
| 0.6333333333333333 | 7.887 |
| 0.6340277777777777 | 7.887 |
| 0.6347222222222222 | 12.257 |
| 0.6354166666666666 | 7.887 |
| 0.6361111111111112 | 7.887 |
| 0.6368055555555555 | 3.525 |
| 0.6375000000000001 | 3.525 |
| 0.6381944444444444 | 3.525 |
| 0.638888888888889 | 7.887 |
| 0.6395833333333333 | 3.525 |
| 0.6402777777777778 | 3.525 |
| 0.6409722222222222 | 3.525 |
| 0.6416666666666667 | 3.525 |
| 0.642361111111111 | 3.525 |
| 0.6430555555555556 | 3.525 |
| 0.6437499999999999 | 3.525 |
| 0.6444444444444445 | 3.525 |
| 0.6451388888888888 | 3.525 |
| 0.6458333333333334 | 3.525 |
| 0.6465277777777778 | 3.525 |
| 0.6472222222222223 | 0 |
| 0.6479166666666667 | 0 |
| 0.6486111111111111 | 0 |
| 0.6493055555555556 | 0 |
| 0.65 | 0 |
| 0.6506944444444445 | 0 |
| 0.6513888888888889 | 0 |
| 0.6520833333333333 | 0 |
| 0.6527777777777778 | 0 |
| 0.6534722222222222 | 0 |
| 0.6541666666666667 | 0 |
| 0.6548611111111111 | 0 |
| 0.6555555555555556 | 0 |
| 0.65625 | 0 |
| 0.6569444444444444 | 0 |
| 0.6576388888888889 | 0 |
| 0.6583333333333333 | 0 |
| 0.6590277777777778 | 0 |
| 0.6597222222222222 | 0 |
| 0.6604166666666667 | 0 |
| 0.6611111111111111 | 0 |
| 0.6618055555555555 | 0 |
| 0.6625 | 0 |
| 0.6631944444444444 | 0 |
| 0.6638888888888889 | 0 |
| 0.6645833333333333 | 0 |
| 0.6652777777777777 | 0 |
| 0.6659722222222222 | 0 |
| 0.6666666666666666 | 0 |
| 0.6673611111111111 | 0 |
| 0.6680555555555556 | 0 |
| 0.6687500000000001 | 0 |
| 0.6694444444444444 | 0 |
| 0.6701388888888888 | 0 |
| 0.6708333333333334 | 0 |
| 0.6715277777777778 | 0 |
| 0.6722222222222222 | 0 |
| 0.6729166666666666 | 0 |
| 0.6736111111111112 | 0 |
| 0.6743055555555556 | 0 |
| 0.6749999999999999 | 0 |
| 0.6756944444444444 | 0 |
| 0.6763888888888889 | 0 |
| 0.6770833333333334 | 0 |
| 0.6777777777777777 | 0 |
| 0.6784722222222223 | 0 |
| 0.6791666666666667 | 0 |
| 0.6798611111111111 | 0 |
| 0.6805555555555555 | 0 |
| 0.68125 | 0 |
| 0.6819444444444445 | 0 |
| 0.6826388888888889 | 0 |
| 0.6833333333333332 | 0 |
| 0.6840277777777778 | 0 |
| 0.6847222222222222 | 0 |
| 0.6854166666666667 | 0 |
| 0.686111111111111 | 0 |
| 0.6868055555555556 | 0 |
| 0.6875 | 0 |
| 0.6881944444444444 | 0 |
| 0.688888888888889 | 0 |
| 0.6895833333333333 | 0 |
| 0.6902777777777778 | 0 |
| 0.6909722222222222 | 0 |
| 0.6916666666666668 | 0 |
| 0.6923611111111111 | 0 |
| 0.6930555555555555 | 0 |
| 0.69375 | 0 |
| 0.6944444444444445 | 0 |
| 0.6951388888888889 | 0 |
| 0.6958333333333333 | 0 |
| 0.6965277777777777 | 0 |
| 0.6972222222222223 | 0 |
| 0.6979166666666666 | 0 |
| 0.6986111111111111 | 0 |
| 0.6993055555555556 | 0 |
| 0.7000000000000001 | 0 |
| 0.7006944444444444 | 0 |
| 0.7013888888888888 | 0 |
| 0.7020833333333334 | 0 |
| 0.7027777777777778 | 0 |
| 0.7034722222222222 | 0 |
| 0.7041666666666666 | 0 |
| 0.7048611111111112 | 0 |
| 0.7055555555555556 | 0 |
| 0.7062499999999999 | 0 |
| 0.7069444444444444 | 0 |
| 0.7076388888888889 | 0 |
| 0.7083333333333334 | 0 |
| 0.7090277777777777 | 0 |
| 0.7097222222222223 | 0 |
| 0.7104166666666667 | 0 |
| 0.7111111111111111 | 0 |
| 0.7118055555555555 | 0 |
| 0.7125 | 0 |
| 0.7131944444444445 | 0 |
| 0.7138888888888889 | 0 |
| 0.7145833333333332 | 0 |
| 0.7152777777777778 | 0 |
| 0.7159722222222222 | 0 |
| 0.7166666666666667 | 0 |
| 0.717361111111111 | 0 |
| 0.7180555555555556 | 0 |
| 0.71875 | 0 |
| 0.7194444444444444 | 0 |
| 0.720138888888889 | 0 |
| 0.7208333333333333 | 0 |
| 0.7215277777777778 | 0 |
| 0.7222222222222222 | 0 |
| 0.7229166666666668 | 0 |
| 0.7236111111111111 | 0 |
| 0.7243055555555555 | 0 |
| 0.725 | 0 |
| 0.7256944444444445 | 0 |
| 0.7263888888888889 | 0 |
| 0.7270833333333333 | 0 |
| 0.7277777777777777 | 0 |
| 0.7284722222222223 | 0 |
| 0.7291666666666666 | 0 |
| 0.7298611111111111 | 0 |
| 0.7305555555555556 | 0 |
| 0.7312500000000001 | 0 |
| 0.7319444444444444 | 0 |
| 0.7326388888888888 | 0 |
| 0.7333333333333334 | 0 |
| 0.7340277777777778 | 0 |
| 0.7347222222222222 | 0 |
| 0.7354166666666666 | 0 |
| 0.7361111111111112 | 0 |
| 0.7368055555555556 | 0 |
| 0.7374999999999999 | 0 |
| 0.7381944444444444 | 0 |
| 0.7388888888888889 | 0 |
| 0.7395833333333334 | 0 |
| 0.7402777777777777 | 0 |
| 0.7409722222222223 | 0 |
| 0.7416666666666667 | 0 |
| 0.7423611111111111 | 0 |
| 0.7430555555555555 | 0 |
| 0.74375 | 0 |
| 0.7444444444444445 | 0 |
| 0.7451388888888889 | 0 |
| 0.7458333333333332 | 0 |
| 0.7465277777777778 | 0 |
| 0.7472222222222222 | 0 |
| 0.7479166666666667 | 0 |
| 0.748611111111111 | 0 |
| 0.7493055555555556 | 0 |
| 0.75 | 0 |
| 0.7506944444444444 | 0 |
| 0.751388888888889 | 0 |
| 0.7520833333333333 | 0 |
| 0.7527777777777778 | 0 |
| 0.7534722222222222 | 0 |
| 0.7541666666666668 | 0 |
| 0.7548611111111111 | 0 |
| 0.7555555555555555 | 0 |
| 0.75625 | 0 |
| 0.7569444444444445 | 0 |
| 0.7576388888888889 | 0 |
| 0.7583333333333333 | 0 |
| 0.7590277777777777 | 0 |
| 0.7597222222222223 | 0 |
| 0.7604166666666666 | 0 |
| 0.7611111111111111 | 0 |
| 0.7618055555555556 | 0 |
| 0.7625000000000001 | 0 |
| 0.7631944444444444 | 0 |
| 0.7638888888888888 | 0 |
| 0.7645833333333334 | 0 |
| 0.7652777777777778 | 0 |
| 0.7659722222222222 | 0 |
| 0.7666666666666666 | 0 |
| 0.7673611111111112 | 0 |
| 0.7680555555555556 | 0 |
| 0.7687499999999999 | 0 |
| 0.7694444444444444 | 0 |
| 0.7701388888888889 | 0 |
| 0.7708333333333334 | 0 |
| 0.7715277777777777 | 0 |
| 0.7722222222222223 | 0 |
| 0.7729166666666667 | 0 |
| 0.7736111111111111 | 0 |
| 0.7743055555555555 | 0 |
| 0.775 | 0 |
| 0.7756944444444445 | 0 |
| 0.7763888888888889 | 0 |
| 0.7770833333333332 | 0 |
| 0.7777777777777778 | 0 |
| 0.7784722222222222 | 0 |
| 0.7791666666666667 | 0 |
| 0.779861111111111 | 0 |
| 0.7805555555555556 | 0 |
| 0.78125 | 0 |
| 0.7819444444444444 | 0 |
| 0.782638888888889 | 0 |
| 0.7833333333333333 | 0 |
| 0.7840277777777778 | 0 |
| 0.7847222222222222 | 0 |
| 0.7854166666666668 | 0 |
| 0.7861111111111111 | 0 |
| 0.7868055555555555 | 0 |
| 0.7875 | 0 |
| 0.7881944444444445 | 0 |
| 0.7888888888888889 | 0 |
| 0.7895833333333333 | 0 |
| 0.7902777777777777 | 0 |
| 0.7909722222222223 | 0 |
| 0.7916666666666666 | 0 |
| 0.7923611111111111 | 0 |
| 0.7930555555555556 | 0 |
| 0.7937500000000001 | 0 |
| 0.7944444444444444 | 0 |
| 0.7951388888888888 | 0 |
| 0.7958333333333334 | 0 |
| 0.7965277777777778 | 0 |
| 0.7972222222222222 | 0 |
| 0.7979166666666666 | 0 |
| 0.7986111111111112 | 0 |
| 0.7993055555555556 | 0 |
| 0.7999999999999999 | 0 |
| 0.8006944444444444 | 0 |
| 0.8013888888888889 | 0 |
| 0.8020833333333334 | 0 |
| 0.8027777777777777 | 0 |
| 0.8034722222222223 | 0 |
| 0.8041666666666667 | 0 |
| 0.8048611111111111 | 0 |
| 0.8055555555555555 | 0 |
| 0.80625 | 0 |
| 0.8069444444444445 | 0 |
| 0.8076388888888889 | 0 |
| 0.8083333333333332 | 0 |
| 0.8090277777777778 | 0 |
| 0.8097222222222222 | 0 |
| 0.8104166666666667 | 0 |
| 0.811111111111111 | 0 |
| 0.8118055555555556 | 0 |
| 0.8125 | 0 |
| 0.8131944444444444 | 0 |
| 0.813888888888889 | 0 |
| 0.8145833333333333 | 0 |
| 0.8152777777777778 | 0 |
| 0.8159722222222222 | 0 |
| 0.8166666666666668 | 0 |
| 0.8173611111111111 | 0 |
| 0.8180555555555555 | 0 |
| 0.81875 | 0 |
| 0.8194444444444445 | 0 |
| 0.8201388888888889 | 0 |
| 0.8208333333333333 | 0 |
| 0.8215277777777777 | 0 |
| 0.8222222222222223 | 0 |
| 0.8229166666666666 | 0 |
| 0.8236111111111111 | 0 |
| 0.8243055555555556 | 0 |
| 0.8250000000000001 | 0 |
| 0.8256944444444444 | 0 |
| 0.8263888888888888 | 0 |
| 0.8270833333333334 | 0 |
| 0.8277777777777778 | 0 |
| 0.8284722222222222 | 0 |
| 0.8291666666666666 | 0 |
| 0.8298611111111112 | 0 |
| 0.8305555555555556 | 0 |
| 0.8312499999999999 | 0 |
| 0.8319444444444444 | 0 |
| 0.8326388888888889 | 0 |
| 0.8333333333333334 | 0 |
| 0.8340277777777777 | 0 |
| 0.8347222222222223 | 0 |
| 0.8354166666666667 | 0 |
| 0.8361111111111111 | 0 |
| 0.8368055555555555 | 0 |
| 0.8375 | 0 |
| 0.8381944444444445 | 0 |
| 0.8388888888888889 | 0 |
| 0.8395833333333332 | 0 |
| 0.8402777777777778 | 0 |
| 0.8409722222222222 | 0 |
| 0.8416666666666667 | 0 |
| 0.842361111111111 | 0 |
| 0.8430555555555556 | 0 |
| 0.84375 | 0 |
| 0.8444444444444444 | 0 |
| 0.845138888888889 | 0 |
| 0.8458333333333333 | 0 |
| 0.8465277777777778 | 0 |
| 0.8472222222222222 | 0 |
| 0.8479166666666668 | 0 |
| 0.8486111111111111 | 0 |
| 0.8493055555555555 | 0 |
| 0.85 | 0 |
| 0.8506944444444445 | 0 |
| 0.8513888888888889 | 0 |
| 0.8520833333333333 | 0 |
| 0.8527777777777777 | 0 |
| 0.8534722222222223 | 0 |
| 0.8541666666666666 | 0 |
| 0.8548611111111111 | 0 |
| 0.8555555555555556 | 0 |
| 0.8562500000000001 | 0 |
| 0.8569444444444444 | 0 |
| 0.8576388888888888 | 0 |
| 0.8583333333333334 | 0 |
| 0.8590277777777778 | 0 |
| 0.8597222222222222 | 0 |
| 0.8604166666666666 | 0 |
| 0.8611111111111112 | 0 |
| 0.8618055555555556 | 0 |
| 0.8624999999999999 | 0 |
| 0.8631944444444444 | 0 |
| 0.8638888888888889 | 0 |
| 0.8645833333333334 | 0 |
| 0.8652777777777777 | 0 |
| 0.8659722222222223 | 0 |
| 0.8666666666666667 | 0 |
| 0.8673611111111111 | 0 |
| 0.8680555555555555 | 0 |
| 0.86875 | 0 |
| 0.8694444444444445 | 0 |
| 0.8701388888888889 | 0 |
| 0.8708333333333332 | 0 |
| 0.8715277777777778 | 0 |
| 0.8722222222222222 | 0 |
| 0.8729166666666667 | 0 |
| 0.873611111111111 | 0 |
| 0.8743055555555556 | 0 |
| 0.875 | 0 |
| 0.8756944444444444 | 0 |
| 0.876388888888889 | 0 |
| 0.8770833333333333 | 0 |
| 0.8777777777777778 | 0 |
| 0.8784722222222222 | 0 |
| 0.8791666666666668 | 0 |
| 0.8798611111111111 | 0 |
| 0.8805555555555555 | 0 |
| 0.88125 | 0 |
| 0.8819444444444445 | 0 |
| 0.8826388888888889 | 0 |
| 0.8833333333333333 | 0 |
| 0.8840277777777777 | 0 |
| 0.8847222222222223 | 0 |
| 0.8854166666666666 | 0 |
| 0.8861111111111111 | 0 |
| 0.8868055555555556 | 0 |
| 0.8875000000000001 | 0 |
| 0.8881944444444444 | 0 |
| 0.8888888888888888 | 0 |
| 0.8895833333333334 | 0 |
| 0.8902777777777778 | 0 |
| 0.8909722222222222 | 0 |
| 0.8916666666666666 | 0 |
| 0.8923611111111112 | 0 |
| 0.8930555555555556 | 0 |
| 0.8937499999999999 | 0 |
| 0.8944444444444444 | 0 |
| 0.8951388888888889 | 0 |
| 0.8958333333333334 | 0 |
| 0.8965277777777777 | 0 |
| 0.8972222222222223 | 0 |
| 0.8979166666666667 | 0 |
| 0.8986111111111111 | 0 |
| 0.8993055555555555 | 0 |
| 0.9 | 0 |
| 0.9006944444444445 | 0 |
| 0.9013888888888889 | 0 |
| 0.9020833333333332 | 0 |
| 0.9027777777777778 | 0 |
| 0.9034722222222222 | 0 |
| 0.9041666666666667 | 0 |
| 0.904861111111111 | 0 |
| 0.9055555555555556 | 0 |
| 0.90625 | 0 |
| 0.9069444444444444 | 0 |
| 0.907638888888889 | 0 |
| 0.9083333333333333 | 0 |
| 0.9090277777777778 | 0 |
| 0.9097222222222222 | 0 |
| 0.9104166666666668 | 0 |
| 0.9111111111111111 | 0 |
| 0.9118055555555555 | 0 |
| 0.9125 | 0 |
| 0.9131944444444445 | 0 |
| 0.9138888888888889 | 0 |
| 0.9145833333333333 | 0 |
| 0.9152777777777777 | 0 |
| 0.9159722222222223 | 0 |
| 0.9166666666666666 | 0 |
| 0.9173611111111111 | 0 |
| 0.9180555555555556 | 0 |
| 0.9187500000000001 | 0 |
| 0.9194444444444444 | 0 |
| 0.9201388888888888 | 0 |
| 0.9208333333333334 | 0 |
| 0.9215277777777778 | 0 |
| 0.9222222222222222 | 0 |
| 0.9229166666666666 | 0 |
| 0.9236111111111112 | 0 |
| 0.9243055555555556 | 0 |
| 0.9249999999999999 | 0 |
| 0.9256944444444444 | 0 |
| 0.9263888888888889 | 0 |
| 0.9270833333333334 | 0 |
| 0.9277777777777777 | 0 |
| 0.9284722222222223 | 0 |
| 0.9291666666666667 | 0 |
| 0.9298611111111111 | 0 |
| 0.9305555555555555 | 0 |
| 0.93125 | 0 |
| 0.9319444444444445 | 0 |
| 0.9326388888888889 | 0 |
| 0.9333333333333332 | 0 |
| 0.9340277777777778 | 0 |
| 0.9347222222222222 | 0 |
| 0.9354166666666667 | 0 |
| 0.936111111111111 | 0 |
| 0.9368055555555556 | 0 |
| 0.9375 | 0 |
| 0.9381944444444444 | 0 |
| 0.938888888888889 | 0 |
| 0.9395833333333333 | 0 |
| 0.9402777777777778 | 0 |
| 0.9409722222222222 | 0 |
| 0.9416666666666668 | 0 |
| 0.9423611111111111 | 0 |
| 0.9430555555555555 | 0 |
| 0.94375 | 0 |
| 0.9444444444444445 | 0 |
| 0.9451388888888889 | 0 |
| 0.9458333333333333 | 0 |
| 0.9465277777777777 | 0 |
| 0.9472222222222223 | 0 |
| 0.9479166666666666 | 0 |
| 0.9486111111111111 | 0 |
| 0.9493055555555556 | 0 |
| 0.9500000000000001 | 0 |
| 0.9506944444444444 | 0 |
| 0.9513888888888888 | 0 |
| 0.9520833333333334 | 0 |
| 0.9527777777777778 | 0 |
| 0.9534722222222222 | 0 |
| 0.9541666666666666 | 0 |
| 0.9548611111111112 | 0 |
| 0.9555555555555556 | 0 |
| 0.9562499999999999 | 0 |
| 0.9569444444444444 | 0 |
| 0.9576388888888889 | 0 |
| 0.9583333333333334 | 0 |
| 0.9590277777777777 | 0 |
| 0.9597222222222223 | 0 |
| 0.9604166666666667 | 0 |
| 0.9611111111111111 | 0 |
| 0.9618055555555555 | 0 |
| 0.9625 | 0 |
| 0.9631944444444445 | 0 |
| 0.9638888888888889 | 0 |
| 0.9645833333333332 | 0 |
| 0.9652777777777778 | 0 |
| 0.9659722222222222 | 0 |
| 0.9666666666666667 | 0 |
| 0.967361111111111 | 0 |
| 0.9680555555555556 | 0 |
| 0.96875 | 0 |
| 0.9694444444444444 | 0 |
| 0.970138888888889 | 0 |
| 0.9708333333333333 | 0 |
| 0.9715277777777778 | 0 |
| 0.9722222222222222 | 0 |
| 0.9729166666666668 | 0 |
| 0.9736111111111111 | 0 |
| 0.9743055555555555 | 0 |
| 0.975 | 0 |
| 0.9756944444444445 | 0 |
| 0.9763888888888889 | 0 |
| 0.9770833333333333 | 0 |
| 0.9777777777777777 | 0 |
| 0.9784722222222223 | 0 |
| 0.9791666666666666 | 0 |
| 0.9798611111111111 | 0 |
| 0.9805555555555556 | 0 |
| 0.9812500000000001 | 0 |
| 0.9819444444444444 | 0 |
| 0.9826388888888888 | 0 |
| 0.9833333333333334 | 0 |
| 0.9840277777777778 | 0 |
| 0.9847222222222222 | 0 |
| 0.9854166666666666 | 0 |
| 0.9861111111111112 | 0 |
| 0.9868055555555556 | 0 |
| 0.9874999999999999 | 0 |
| 0.9881944444444444 | 0 |
| 0.9888888888888889 | 0 |
| 0.9895833333333334 | 0 |
| 0.9902777777777777 | 0 |
| 0.9909722222222223 | 0 |
| 0.9916666666666667 | 0 |
| 0.9923611111111111 | 0 |
| 0.9930555555555555 | 0 |
| 0.99375 | 0 |
| 0.9944444444444445 | 0 |
| 0.9951388888888889 | 0 |
| 0.9958333333333332 | 0 |
| 0.9965277777777778 | 0 |
| 0.9972222222222222 | 0 |
| 0.9979166666666667 | 0 |
| 0.998611111111111 | 0 |
| 0.9993055555555556 | 0 |